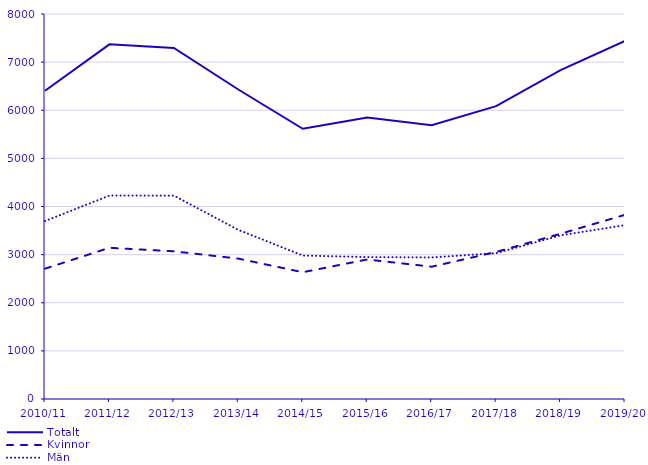
| Category | Totalt | Kvinnor | Män |
|---|---|---|---|
| 2010/11 | 6405 | 2708 | 3697 |
| 2011/12 | 7369 | 3142 | 4227 |
| 2012/13 | 7295 | 3069 | 4226 |
| 2013/14 | 6431 | 2917 | 3514 |
| 2014/15 | 5615 | 2634 | 2981 |
| 2015/16 | 5848 | 2899 | 2949 |
| 2016/17 | 5691 | 2749 | 2942 |
| 2017/18 | 6085 | 3055 | 3030 |
| 2018/19 | 6834 | 3434 | 3400 |
| 2019/20 | 7440 | 3827 | 3613 |